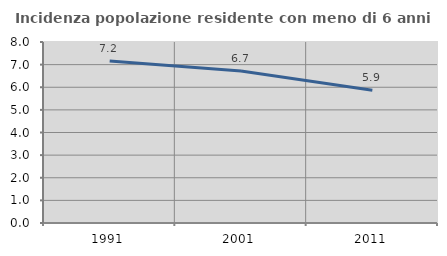
| Category | Incidenza popolazione residente con meno di 6 anni |
|---|---|
| 1991.0 | 7.165 |
| 2001.0 | 6.717 |
| 2011.0 | 5.866 |